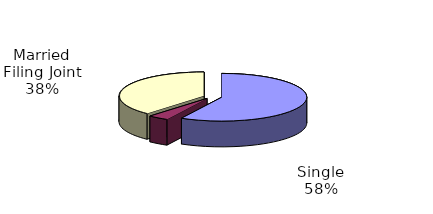
| Category | Series 0 |
|---|---|
| Single | 2239611 |
| Married Filing Separate | 150347 |
| Married Filing Joint | 1482440 |